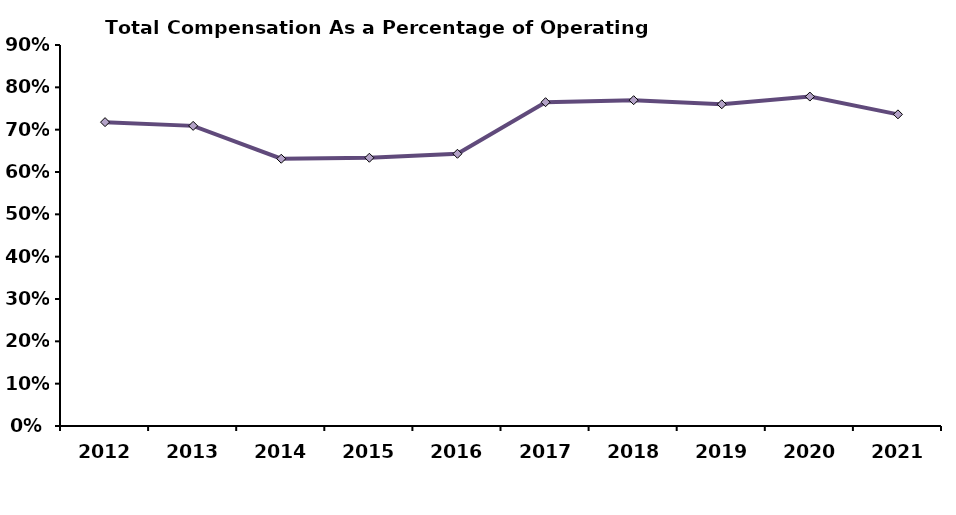
| Category | Total Compensation |
|---|---|
| 2012.0 | 0.718 |
| 2013.0 | 0.709 |
| 2014.0 | 0.631 |
| 2015.0 | 0.634 |
| 2016.0 | 0.643 |
| 2017.0 | 0.765 |
| 2018.0 | 0.77 |
| 2019.0 | 0.76 |
| 2020.0 | 0.778 |
| 2021.0 | 0.736 |